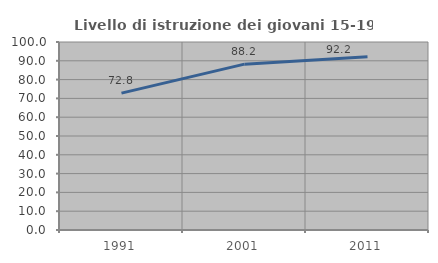
| Category | Livello di istruzione dei giovani 15-19 anni |
|---|---|
| 1991.0 | 72.816 |
| 2001.0 | 88.226 |
| 2011.0 | 92.169 |